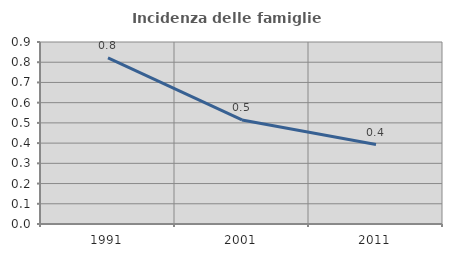
| Category | Incidenza delle famiglie numerose |
|---|---|
| 1991.0 | 0.821 |
| 2001.0 | 0.515 |
| 2011.0 | 0.393 |